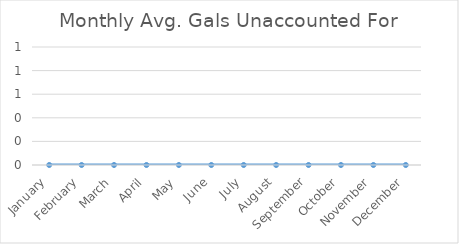
| Category | Monthly Avg. Gals |
|---|---|
| January | 0 |
| February | 0 |
| March | 0 |
| April | 0 |
| May | 0 |
| June | 0 |
| July | 0 |
| August | 0 |
| September | 0 |
| October | 0 |
| November | 0 |
| December | 0 |